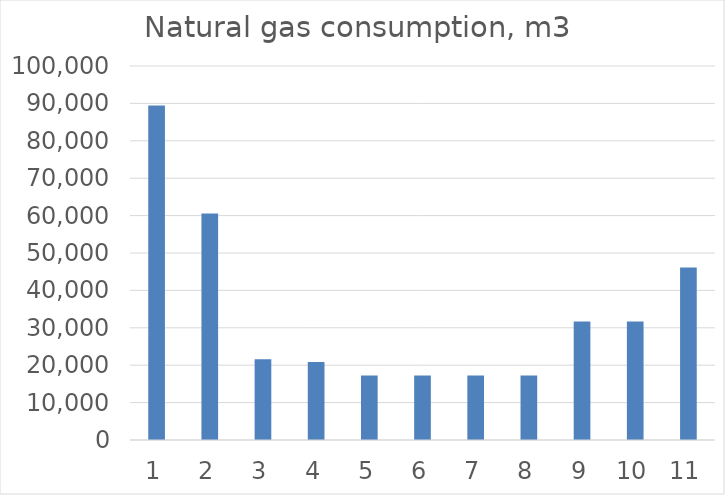
| Category | 452.585 |
|---|---|
| 0 | 89462.88 |
| 1 | 60580.594 |
| 2 | 21589.509 |
| 3 | 20867.451 |
| 4 | 17257.166 |
| 5 | 17257.166 |
| 6 | 17257.166 |
| 7 | 17257.166 |
| 8 | 31698.309 |
| 9 | 31698.309 |
| 10 | 46139.451 |